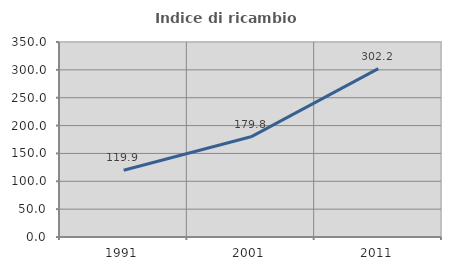
| Category | Indice di ricambio occupazionale  |
|---|---|
| 1991.0 | 119.919 |
| 2001.0 | 179.828 |
| 2011.0 | 302.21 |